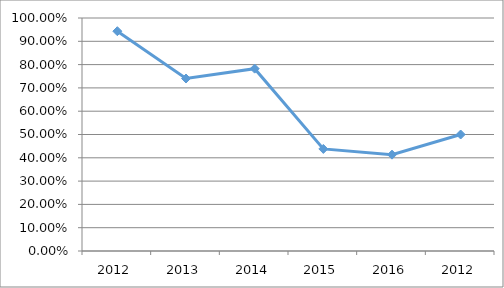
| Category | DIME-D6O12 |
|---|---|
| 2012.0 | 0.943 |
| 2013.0 | 0.74 |
| 2014.0 | 0.783 |
| 2015.0 | 0.438 |
| 2016.0 | 0.414 |
| 2012.0 | 0.5 |